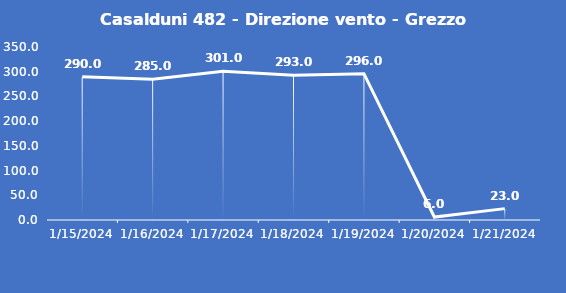
| Category | Casalduni 482 - Direzione vento - Grezzo (°N) |
|---|---|
| 1/15/24 | 290 |
| 1/16/24 | 285 |
| 1/17/24 | 301 |
| 1/18/24 | 293 |
| 1/19/24 | 296 |
| 1/20/24 | 6 |
| 1/21/24 | 23 |